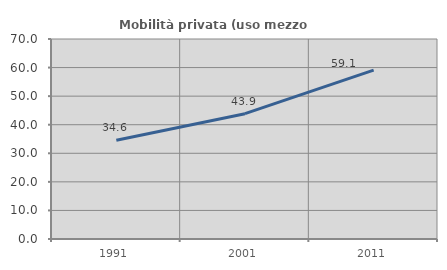
| Category | Mobilità privata (uso mezzo privato) |
|---|---|
| 1991.0 | 34.56 |
| 2001.0 | 43.86 |
| 2011.0 | 59.091 |